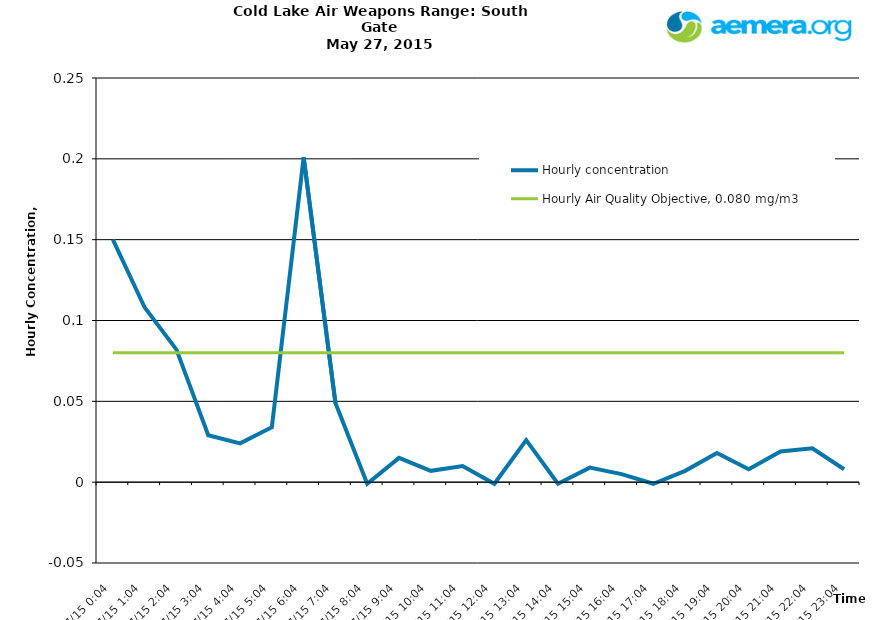
| Category | Hourly concentration | Hourly Air Quality Objective, 0.080 mg/m3 |
|---|---|---|
| 5/27/15 | 0.15 | 0.08 |
| 5/27/15 | 0.108 | 0.08 |
| 5/27/15 | 0.082 | 0.08 |
| 5/27/15 | 0.029 | 0.08 |
| 5/27/15 | 0.024 | 0.08 |
| 5/27/15 | 0.034 | 0.08 |
| 5/27/15 | 0.201 | 0.08 |
| 5/27/15 | 0.049 | 0.08 |
| 5/27/15 | -0.001 | 0.08 |
| 5/27/15 | 0.015 | 0.08 |
| 5/27/15 | 0.007 | 0.08 |
| 5/27/15 | 0.01 | 0.08 |
| 5/27/15 | -0.001 | 0.08 |
| 5/27/15 | 0.026 | 0.08 |
| 5/27/15 | -0.001 | 0.08 |
| 5/27/15 | 0.009 | 0.08 |
| 5/27/15 | 0.005 | 0.08 |
| 5/27/15 | -0.001 | 0.08 |
| 5/27/15 | 0.007 | 0.08 |
| 5/27/15 | 0.018 | 0.08 |
| 5/27/15 | 0.008 | 0.08 |
| 5/27/15 | 0.019 | 0.08 |
| 5/27/15 | 0.021 | 0.08 |
| 5/27/15 | 0.008 | 0.08 |